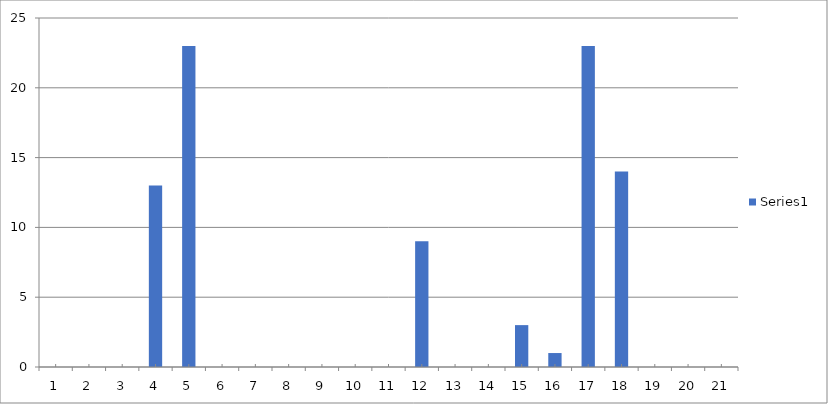
| Category | Series 0 |
|---|---|
| 0 | 0 |
| 1 | 0 |
| 2 | 0 |
| 3 | 13 |
| 4 | 23 |
| 5 | 0 |
| 6 | 0 |
| 7 | 0 |
| 8 | 0 |
| 9 | 0 |
| 10 | 0 |
| 11 | 9 |
| 12 | 0 |
| 13 | 0 |
| 14 | 3 |
| 15 | 1 |
| 16 | 23 |
| 17 | 14 |
| 18 | 0 |
| 19 | 0 |
| 20 | 0 |